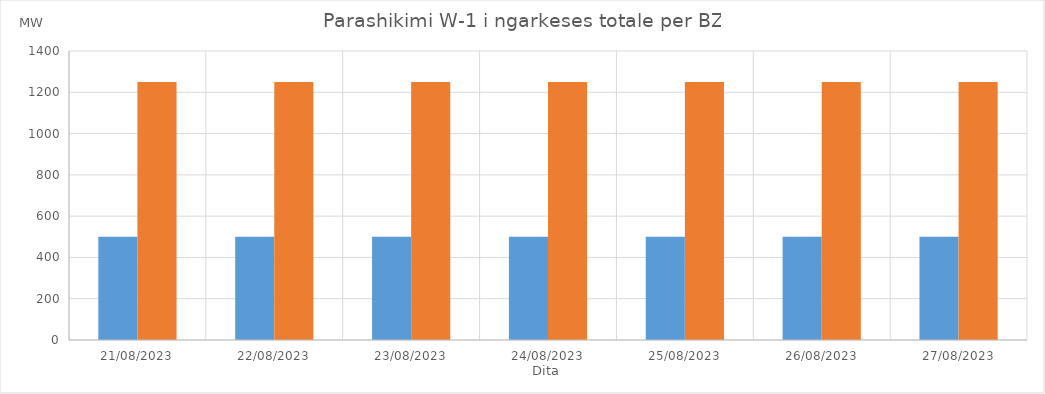
| Category | Min (MW) | Max (MW) |
|---|---|---|
| 21/08/2023 | 500 | 1250 |
| 22/08/2023 | 500 | 1250 |
| 23/08/2023 | 500 | 1250 |
| 24/08/2023 | 500 | 1250 |
| 25/08/2023 | 500 | 1250 |
| 26/08/2023 | 500 | 1250 |
| 27/08/2023 | 500 | 1250 |